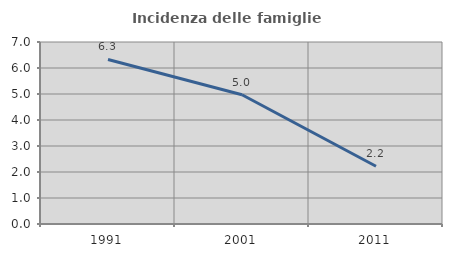
| Category | Incidenza delle famiglie numerose |
|---|---|
| 1991.0 | 6.329 |
| 2001.0 | 4.97 |
| 2011.0 | 2.222 |